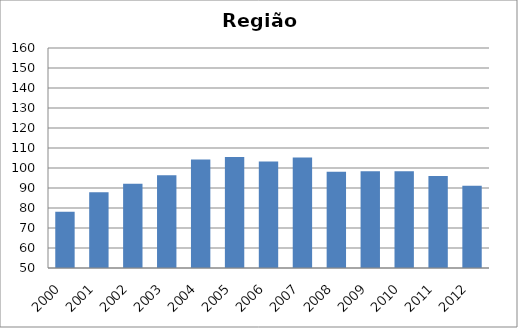
| Category | Tetravalente/DTP |
|---|---|
| 2000.0 | 78.13 |
| 2001.0 | 87.85 |
| 2002.0 | 92.14 |
| 2003.0 | 96.39 |
| 2004.0 | 104.22 |
| 2005.0 | 105.49 |
| 2006.0 | 103.27 |
| 2007.0 | 105.31 |
| 2008.0 | 98.15 |
| 2009.0 | 98.41 |
| 2010.0 | 98.36 |
| 2011.0 | 95.96 |
| 2012.0 | 91.12 |